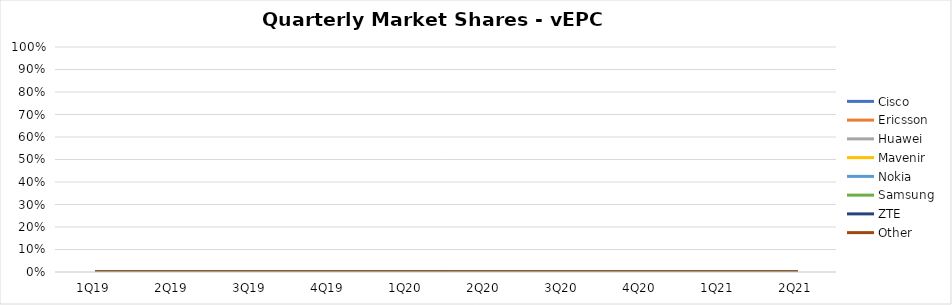
| Category | Cisco | Ericsson | Huawei | Mavenir | Nokia | Samsung | ZTE | Other |
|---|---|---|---|---|---|---|---|---|
| 1Q19 | 0 | 0 | 0 | 0 | 0 | 0 | 0 | 0 |
| 2Q19 | 0 | 0 | 0 | 0 | 0 | 0 | 0 | 0 |
| 3Q19 | 0 | 0 | 0 | 0 | 0 | 0 | 0 | 0 |
| 4Q19 | 0 | 0 | 0 | 0 | 0 | 0 | 0 | 0 |
| 1Q20 | 0 | 0 | 0 | 0 | 0 | 0 | 0 | 0 |
| 2Q20 | 0 | 0 | 0 | 0 | 0 | 0 | 0 | 0 |
| 3Q20 | 0 | 0 | 0 | 0 | 0 | 0 | 0 | 0 |
| 4Q20 | 0 | 0 | 0 | 0 | 0 | 0 | 0 | 0 |
| 1Q21 | 0 | 0 | 0 | 0 | 0 | 0 | 0 | 0 |
| 2Q21 | 0 | 0 | 0 | 0 | 0 | 0 | 0 | 0 |